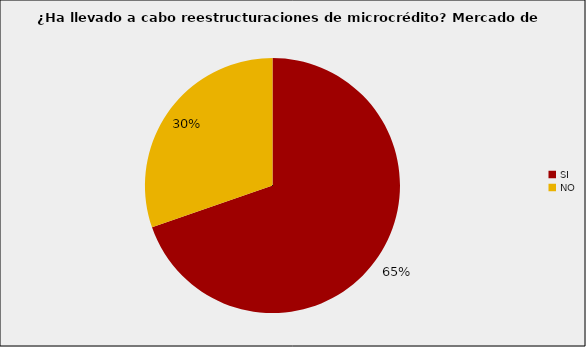
| Category | Mercado de Microcrédito |
|---|---|
| SI | 0.697 |
| NO | 0.303 |